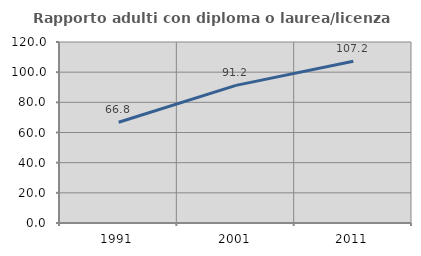
| Category | Rapporto adulti con diploma o laurea/licenza media  |
|---|---|
| 1991.0 | 66.759 |
| 2001.0 | 91.246 |
| 2011.0 | 107.246 |